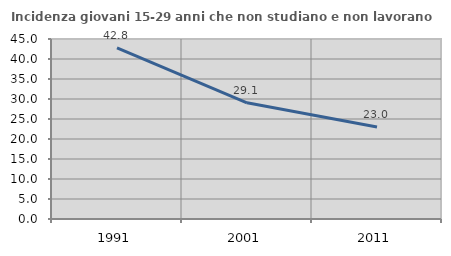
| Category | Incidenza giovani 15-29 anni che non studiano e non lavorano  |
|---|---|
| 1991.0 | 42.794 |
| 2001.0 | 29.06 |
| 2011.0 | 23.009 |